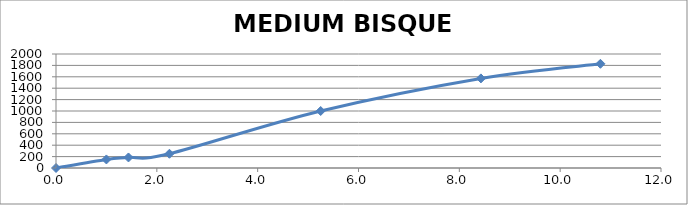
| Category | MEDIUM BISQUE CHART |
|---|---|
| 0.0 | 0 |
| 1.0 | 150 |
| 1.4375 | 185 |
| 2.25 | 250 |
| 5.25 | 1000 |
| 8.427777777777777 | 1572 |
| 10.79814814814815 | 1828 |